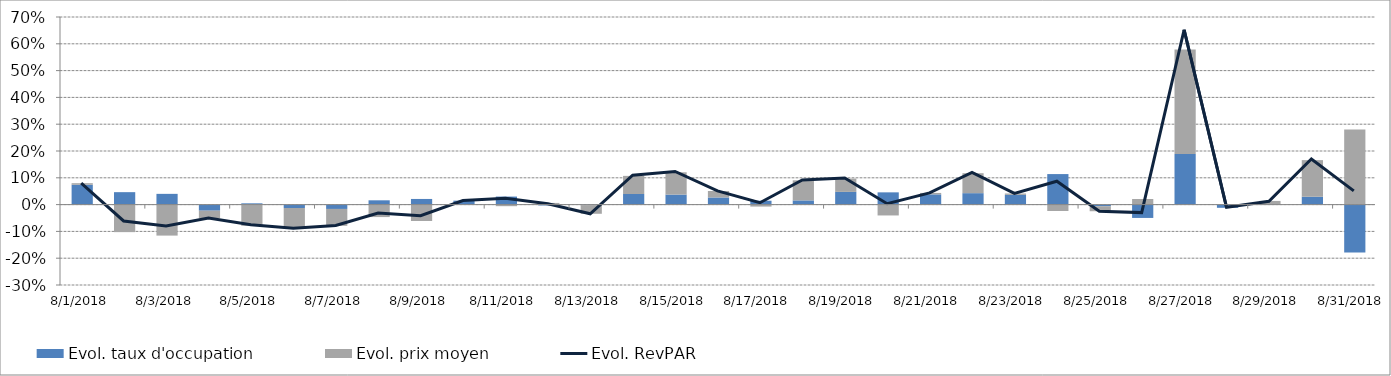
| Category | Evol. taux d'occupation | Evol. prix moyen |
|---|---|---|
| 8/1/18 | 0.074 | 0.006 |
| 8/2/18 | 0.046 | -0.103 |
| 8/3/18 | 0.04 | -0.116 |
| 8/4/18 | -0.023 | -0.028 |
| 8/5/18 | 0.005 | -0.079 |
| 8/6/18 | -0.013 | -0.077 |
| 8/7/18 | -0.016 | -0.063 |
| 8/8/18 | 0.016 | -0.047 |
| 8/9/18 | 0.021 | -0.061 |
| 8/10/18 | 0.015 | 0 |
| 8/11/18 | 0.03 | -0.006 |
| 8/12/18 | -0.003 | 0.006 |
| 8/13/18 | -0.002 | -0.032 |
| 8/14/18 | 0.04 | 0.068 |
| 8/15/18 | 0.037 | 0.083 |
| 8/16/18 | 0.027 | 0.024 |
| 8/17/18 | 0.014 | -0.007 |
| 8/18/18 | 0.016 | 0.075 |
| 8/19/18 | 0.047 | 0.05 |
| 8/20/18 | 0.046 | -0.041 |
| 8/21/18 | 0.038 | 0.005 |
| 8/22/18 | 0.043 | 0.074 |
| 8/23/18 | 0.036 | 0.005 |
| 8/24/18 | 0.114 | -0.024 |
| 8/25/18 | -0.006 | -0.019 |
| 8/26/18 | -0.05 | 0.021 |
| 8/27/18 | 0.189 | 0.39 |
| 8/28/18 | -0.012 | 0.002 |
| 8/29/18 | -0.001 | 0.014 |
| 8/30/18 | 0.029 | 0.137 |
| 8/31/18 | -0.179 | 0.28 |